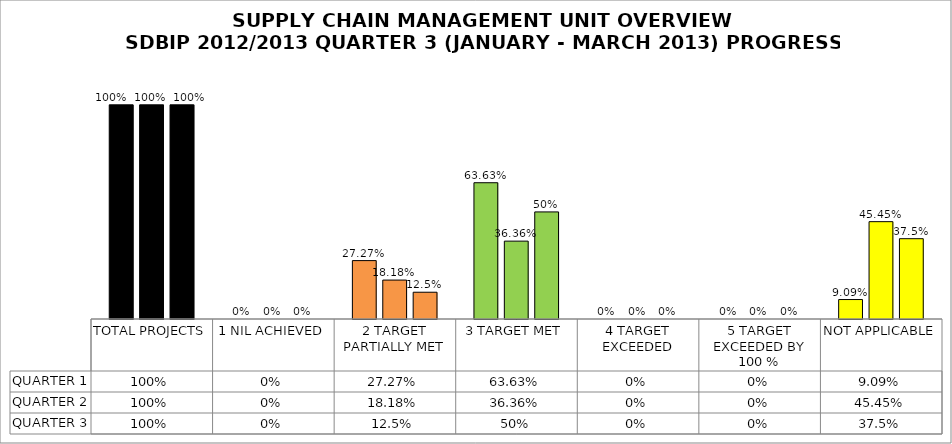
| Category | QUARTER 1 | QUARTER 2 | QUARTER 3 |
|---|---|---|---|
| TOTAL PROJECTS | 1 | 1 | 1 |
| 1 NIL ACHIEVED | 0 | 0 | 0 |
| 2 TARGET PARTIALLY MET | 0.273 | 0.182 | 0.125 |
| 3 TARGET MET | 0.636 | 0.364 | 0.5 |
| 4 TARGET EXCEEDED | 0 | 0 | 0 |
| 5 TARGET EXCEEDED BY 100 % | 0 | 0 | 0 |
| NOT APPLICABLE | 0.091 | 0.454 | 0.375 |